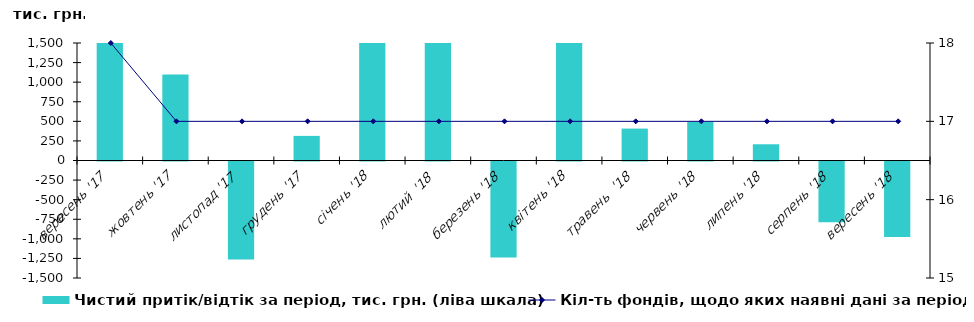
| Category | Чистий притік/відтік за період, тис. грн. (ліва шкала) |
|---|---|
| вересень '17 | 1554.716 |
| жовтень '17 | 1098.918 |
| листопад '17 | -1250.645 |
| грудень '17 | 314.249 |
| січень '18 | 1782.967 |
| лютий  '18 | 1586.636 |
| березень '18 | -1224.388 |
| квітень '18 | 1868.195 |
| травень  '18 | 407.295 |
| червень '18 | 494.616 |
| липень '18 | 207.262 |
| серпень '18 | -776.577 |
| вересень '18 | -962.329 |